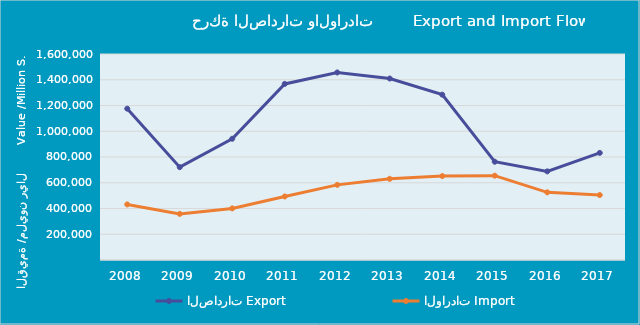
| Category | الصادرات | الواردات |
|---|---|---|
| 2008.0 | 1175481893760 | 431752651244 |
| 2009.0 | 721109334611 | 358290170148 |
| 2010.0 | 941785072434 | 400735520910 |
| 2011.0 | 1367619830684 | 493449082585 |
| 2012.0 | 1456502163451 | 583473067875 |
| 2013.0 | 1409523296716 | 630582433092 |
| 2014.0 | 1284121545536 | 651875760674 |
| 2015.0 | 763313062522 | 655033363532 |
| 2016.0 | 688423019366 | 525635962804 |
| 2017.0 | 831881287830 | 504446616737 |